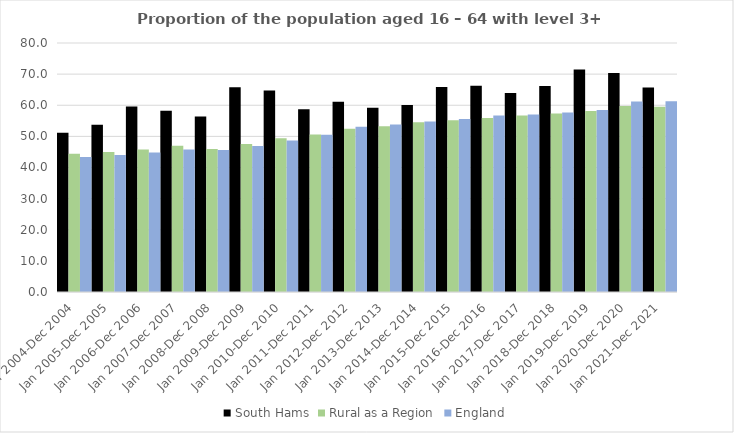
| Category | South Hams | Rural as a Region | England |
|---|---|---|---|
| Jan 2004-Dec 2004 | 51.2 | 44.405 | 43.4 |
| Jan 2005-Dec 2005 | 53.7 | 44.973 | 44 |
| Jan 2006-Dec 2006 | 59.6 | 45.774 | 44.8 |
| Jan 2007-Dec 2007 | 58.2 | 46.968 | 45.8 |
| Jan 2008-Dec 2008 | 56.4 | 45.964 | 45.6 |
| Jan 2009-Dec 2009 | 65.8 | 47.59 | 46.9 |
| Jan 2010-Dec 2010 | 64.7 | 49.362 | 48.7 |
| Jan 2011-Dec 2011 | 58.7 | 50.602 | 50.5 |
| Jan 2012-Dec 2012 | 61.1 | 52.439 | 53.1 |
| Jan 2013-Dec 2013 | 59.2 | 53.276 | 53.8 |
| Jan 2014-Dec 2014 | 60.1 | 54.57 | 54.8 |
| Jan 2015-Dec 2015 | 65.9 | 55.16 | 55.6 |
| Jan 2016-Dec 2016 | 66.3 | 55.941 | 56.7 |
| Jan 2017-Dec 2017 | 63.9 | 56.689 | 57 |
| Jan 2018-Dec 2018 | 66.2 | 57.389 | 57.7 |
| Jan 2019-Dec 2019 | 71.5 | 58.147 | 58.5 |
| Jan 2020-Dec 2020 | 70.4 | 59.771 | 61.2 |
| Jan 2021-Dec 2021 | 65.7 | 59.54 | 61.3 |